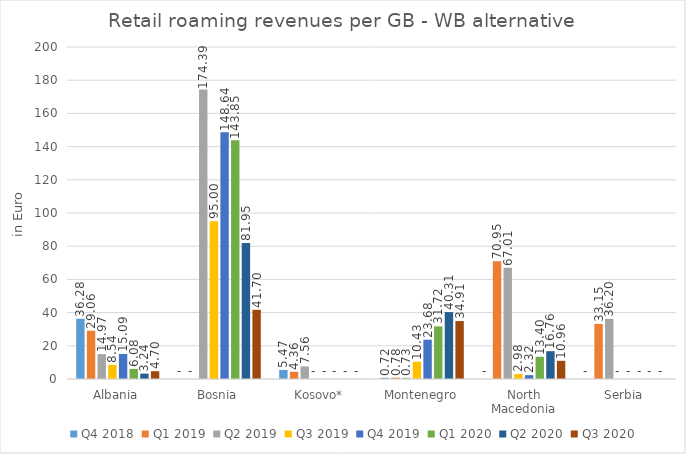
| Category | Q4 2018 | Q1 2019 | Q2 2019 | Q3 2019 | Q4 2019 | Q1 2020 | Q2 2020 | Q3 2020 |
|---|---|---|---|---|---|---|---|---|
| Albania | 36.283 | 29.061 | 14.965 | 8.545 | 15.091 | 6.083 | 3.241 | 4.696 |
| Bosnia | 0 | 0 | 174.387 | 95.004 | 148.635 | 143.852 | 81.95 | 41.7 |
| Kosovo* | 5.466 | 4.358 | 7.561 | 0 | 0 | 0 | 0 | 0 |
| Montenegro | 0.717 | 0.783 | 0.729 | 10.43 | 23.676 | 31.721 | 40.313 | 34.907 |
| North Macedonia | 0 | 70.947 | 67.011 | 2.978 | 2.317 | 13.395 | 16.761 | 10.961 |
| Serbia | 0 | 33.154 | 36.205 | 0 | 0 | 0 | 0 | 0 |